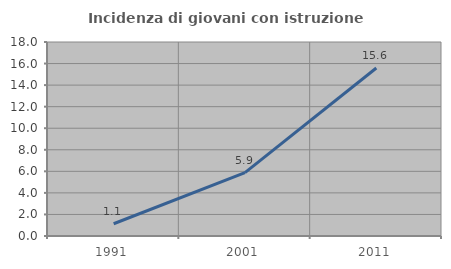
| Category | Incidenza di giovani con istruzione universitaria |
|---|---|
| 1991.0 | 1.136 |
| 2001.0 | 5.882 |
| 2011.0 | 15.584 |